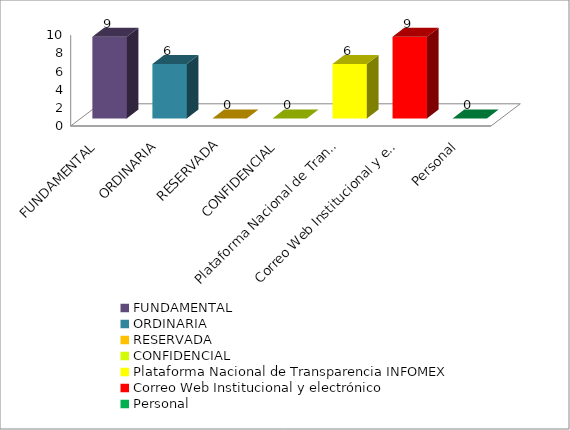
| Category | Series 2 |
|---|---|
| FUNDAMENTAL | 9 |
| ORDINARIA | 6 |
| RESERVADA | 0 |
| CONFIDENCIAL | 0 |
| Plataforma Nacional de Transparencia INFOMEX | 6 |
| Correo Web Institucional y electrónico | 9 |
| Personal | 0 |